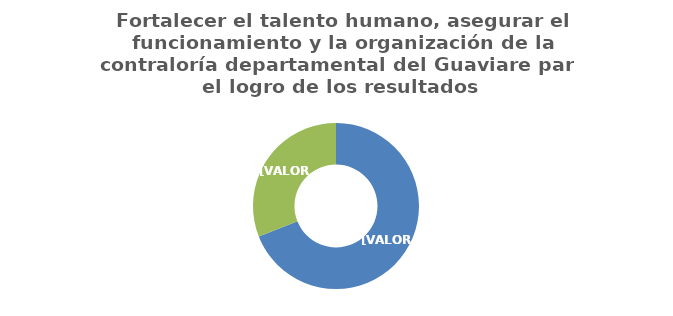
| Category | Fortalecer el talento humano, asegurar el funcionamiento y la organización de la contraloría departamental del Guaviare para el logro de los resultados |
|---|---|
| Avance 1° Semestre
(ejecución acumulada a junio de 2020) | 0.69 |
| Diferencia
(ejecución faltante para completar la meta establecida) | 0.31 |